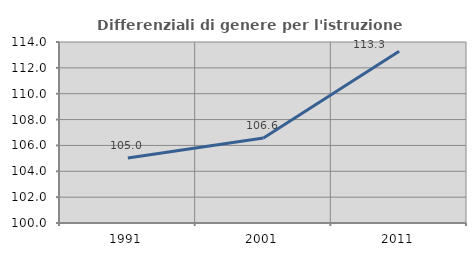
| Category | Differenziali di genere per l'istruzione superiore |
|---|---|
| 1991.0 | 105.03 |
| 2001.0 | 106.579 |
| 2011.0 | 113.284 |